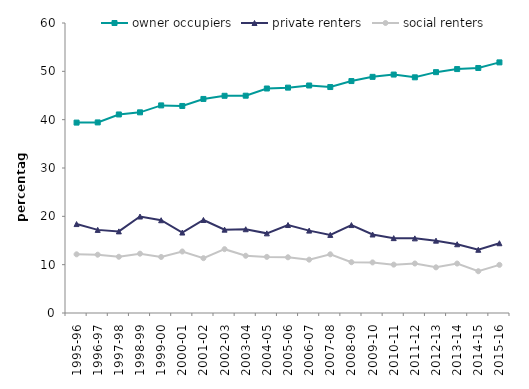
| Category | owner occupiers | private renters | social renters |
|---|---|---|---|
| 1995-96 | 39.394 | 18.399 | 12.143 |
| 1996-97 | 39.431 | 17.198 | 12.063 |
| 1997-98 | 41.076 | 16.888 | 11.634 |
| 1998-99 | 41.516 | 19.961 | 12.272 |
| 1999-00 | 42.95 | 19.191 | 11.594 |
| 2000-01 | 42.835 | 16.646 | 12.725 |
| 2001-02 | 44.288 | 19.246 | 11.345 |
| 2002-03 | 44.94 | 17.243 | 13.205 |
| 2003-04 | 44.959 | 17.329 | 11.845 |
| 2004-05 | 46.448 | 16.479 | 11.611 |
| 2005-06 | 46.627 | 18.202 | 11.526 |
| 2006-07 | 47.071 | 17.046 | 11.035 |
| 2007-08 | 46.75 | 16.16 | 12.145 |
| 2008-09 | 47.988 | 18.191 | 10.511 |
| 2009-10 | 48.857 | 16.244 | 10.467 |
| 2010-11 | 49.335 | 15.489 | 10.008 |
| 2011-12 | 48.76 | 15.44 | 10.242 |
| 2012-13 | 49.831 | 14.968 | 9.448 |
| 2013-14 | 50.467 | 14.221 | 10.229 |
| 2014-15 | 50.692 | 13.081 | 8.643 |
| 2015-16 | 51.851 | 14.434 | 9.958 |